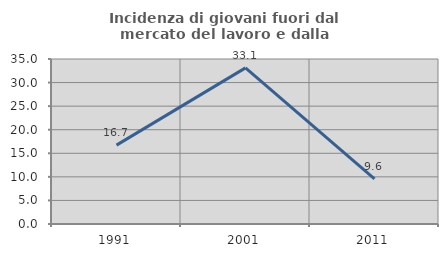
| Category | Incidenza di giovani fuori dal mercato del lavoro e dalla formazione  |
|---|---|
| 1991.0 | 16.733 |
| 2001.0 | 33.113 |
| 2011.0 | 9.589 |